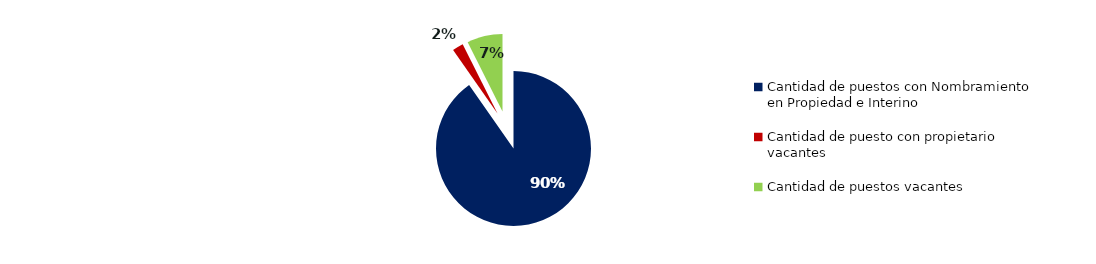
| Category | Series 0 |
|---|---|
| Cantidad de puestos con Nombramiento en Propiedad e Interino | 2641 |
| Cantidad de puesto con propietario vacantes | 67 |
| Cantidad de puestos vacantes | 217 |